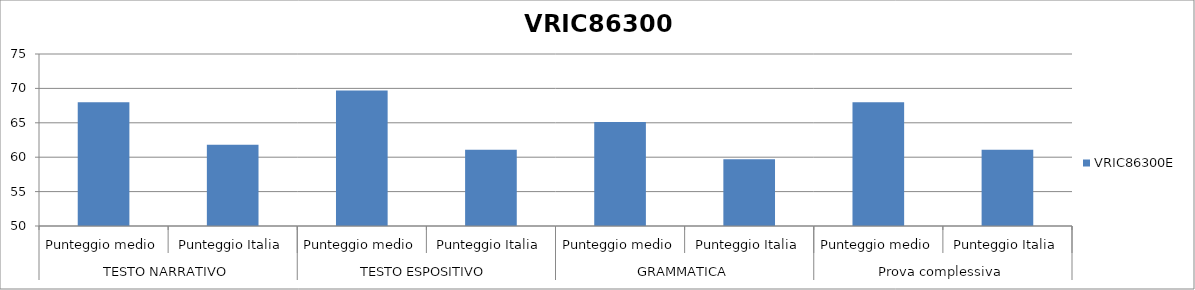
| Category | VRIC86300E |
|---|---|
| 0 | 68 |
| 1 | 61.8 |
| 2 | 69.7 |
| 3 | 61.1 |
| 4 | 65.1 |
| 5 | 59.7 |
| 6 | 68 |
| 7 | 61.1 |